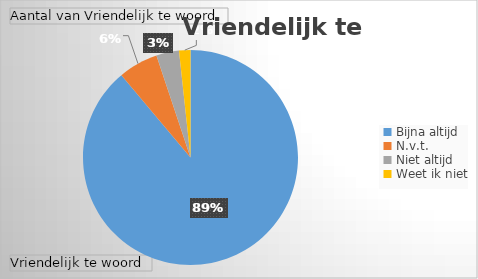
| Category | Totaal |
|---|---|
| Bijna altijd | 104 |
| N.v.t. | 7 |
| Niet altijd | 4 |
| Weet ik niet | 2 |